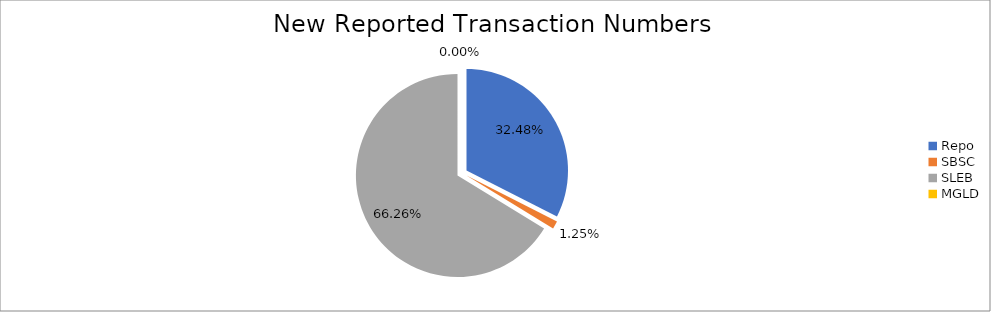
| Category | Series 0 |
|---|---|
| Repo | 265822 |
| SBSC | 10244 |
| SLEB | 542223 |
| MGLD | 4 |